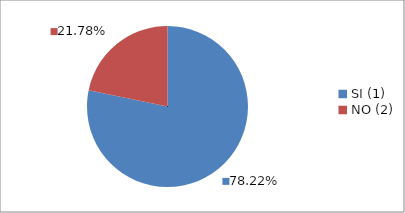
| Category | Series 0 |
|---|---|
| SI (1) | 0.782 |
| NO (2) | 0.218 |